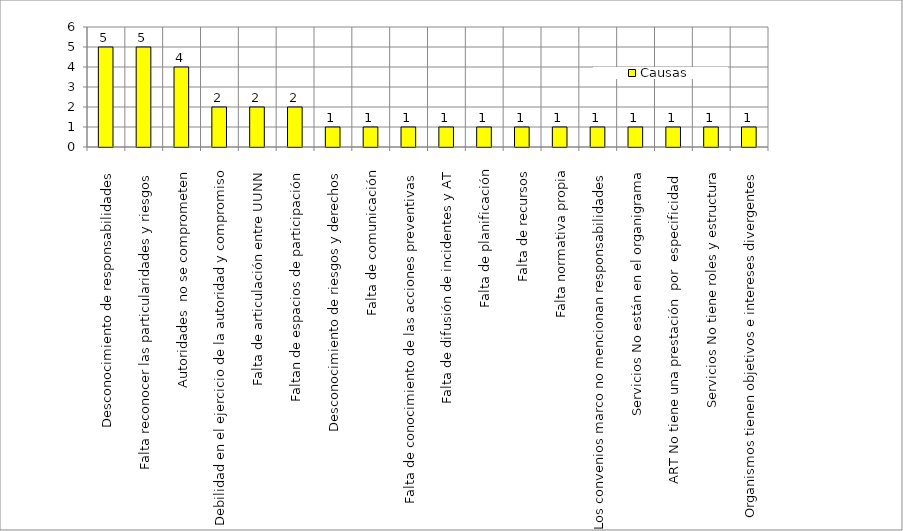
| Category | Causas |
|---|---|
| Desconocimiento de responsabilidades  | 5 |
| Falta reconocer las particularidades y riesgos  | 5 |
| Autoridades  no se comprometen  | 4 |
| Debilidad en el ejercicio de la autoridad y compromiso | 2 |
| Falta de articulación entre UUNN  | 2 |
| Faltan de espacios de participación  | 2 |
| Desconocimiento de riesgos y derechos  | 1 |
| Falta de comunicación  | 1 |
| Falta de conocimiento de las acciones preventivas  | 1 |
| Falta de difusión de incidentes y AT  | 1 |
| Falta de planificación  | 1 |
| Falta de recursos  | 1 |
| Falta normativa propia  | 1 |
| Los convenios marco no mencionan responsabilidades  | 1 |
| Servicios No están en el organigrama  | 1 |
| ART No tiene una prestación  por  especificidad  | 1 |
| Servicios No tiene roles y estructura  | 1 |
| Organismos tienen objetivos e intereses divergentes  | 1 |